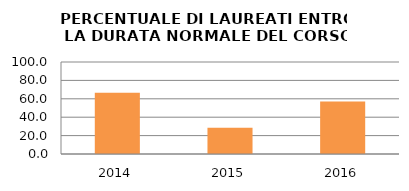
| Category | 2014 2015 2016 |
|---|---|
| 2014.0 | 66.667 |
| 2015.0 | 28.571 |
| 2016.0 | 57.143 |